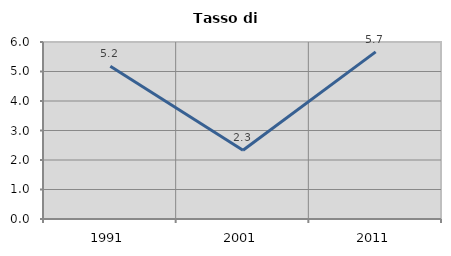
| Category | Tasso di disoccupazione   |
|---|---|
| 1991.0 | 5.179 |
| 2001.0 | 2.328 |
| 2011.0 | 5.665 |